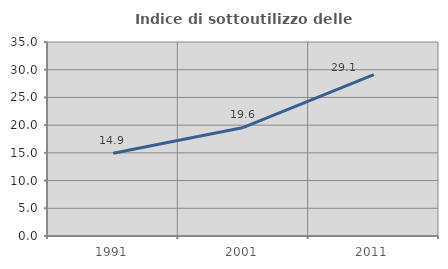
| Category | Indice di sottoutilizzo delle abitazioni  |
|---|---|
| 1991.0 | 14.937 |
| 2001.0 | 19.591 |
| 2011.0 | 29.103 |